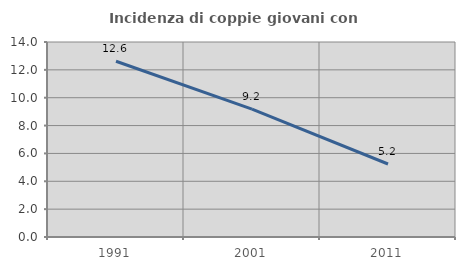
| Category | Incidenza di coppie giovani con figli |
|---|---|
| 1991.0 | 12.617 |
| 2001.0 | 9.186 |
| 2011.0 | 5.24 |